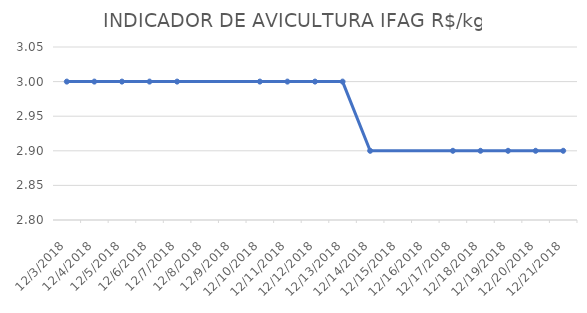
| Category | INDICADOR DE AVICULTURA IFAG |
|---|---|
| 12/3/18 | 3 |
| 12/4/18 | 3 |
| 12/5/18 | 3 |
| 12/6/18 | 3 |
| 12/7/18 | 3 |
| 12/10/18 | 3 |
| 12/11/18 | 3 |
| 12/12/18 | 3 |
| 12/13/18 | 3 |
| 12/14/18 | 2.9 |
| 12/17/18 | 2.9 |
| 12/18/18 | 2.9 |
| 12/19/18 | 2.9 |
| 12/20/18 | 2.9 |
| 12/21/18 | 2.9 |